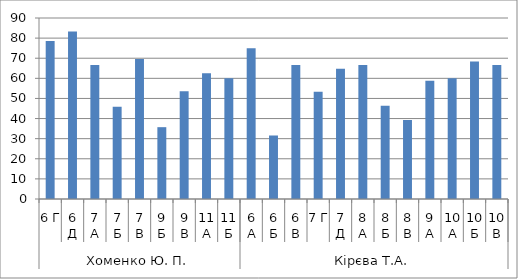
| Category | Series 0 |
|---|---|
| 0 | 78.571 |
| 1 | 83.333 |
| 2 | 66.667 |
| 3 | 45.833 |
| 4 | 69.565 |
| 5 | 35.714 |
| 6 | 53.571 |
| 7 | 62.5 |
| 8 | 60 |
| 9 | 75 |
| 10 | 31.579 |
| 11 | 66.667 |
| 12 | 53.333 |
| 13 | 64.706 |
| 14 | 66.667 |
| 15 | 46.429 |
| 16 | 39.286 |
| 17 | 58.824 |
| 18 | 60 |
| 19 | 68.421 |
| 20 | 66.667 |